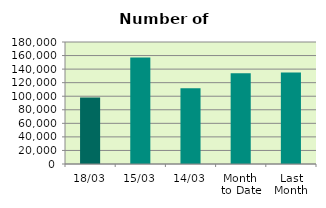
| Category | Series 0 |
|---|---|
| 18/03 | 98200 |
| 15/03 | 157128 |
| 14/03 | 111592 |
| Month 
to Date | 133765.833 |
| Last
Month | 135041.7 |